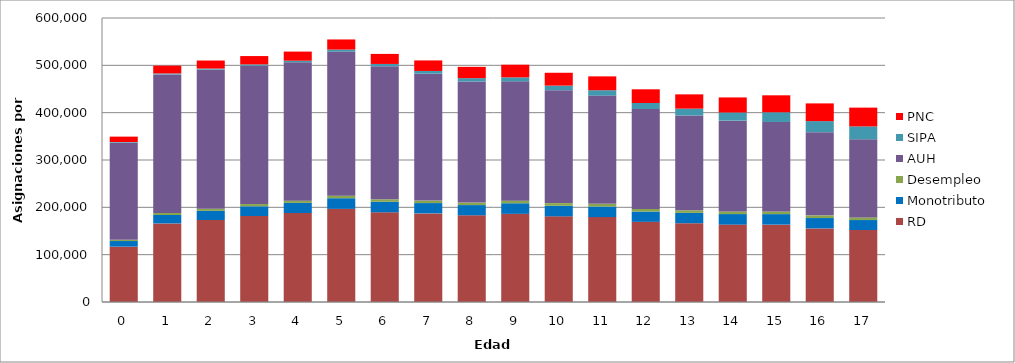
| Category | RD | Monotributo | Desempleo | AUH | SIPA | PNC |
|---|---|---|---|---|---|---|
| 0.0 | 116900 | 11906 | 2606 | 205281 | 1360 | 11333 |
| 1.0 | 166000 | 17747 | 4353 | 292736 | 2051 | 16405 |
| 2.0 | 173220 | 19309 | 4559 | 293804 | 2303 | 16954 |
| 3.0 | 181667 | 20560 | 4750 | 292258 | 2780 | 17565 |
| 4.0 | 187984 | 21387 | 4764 | 292224 | 3409 | 19268 |
| 5.0 | 196755 | 22511 | 5362 | 304386 | 4290 | 21374 |
| 6.0 | 189504 | 22270 | 5227 | 281096 | 4830 | 21220 |
| 7.0 | 187226 | 21766 | 5273 | 268051 | 5807 | 22232 |
| 8.0 | 183173 | 21588 | 5285 | 255848 | 7001 | 23900 |
| 9.0 | 186246 | 22396 | 5450 | 252150 | 8322 | 26753 |
| 10.0 | 180917 | 22440 | 5565 | 238495 | 9735 | 27154 |
| 11.0 | 179362 | 22325 | 5621 | 228711 | 11407 | 29238 |
| 12.0 | 169329 | 21710 | 5572 | 211096 | 12765 | 28883 |
| 13.0 | 166453 | 21876 | 5397 | 200305 | 14507 | 30123 |
| 14.0 | 163470 | 22296 | 5521 | 191865 | 17220 | 31822 |
| 15.0 | 163418 | 22270 | 5652 | 189003 | 20508 | 35824 |
| 16.0 | 155468 | 21917 | 5650 | 175628 | 23489 | 37440 |
| 17.0 | 152106 | 21042 | 5601 | 164966 | 27204 | 39741 |